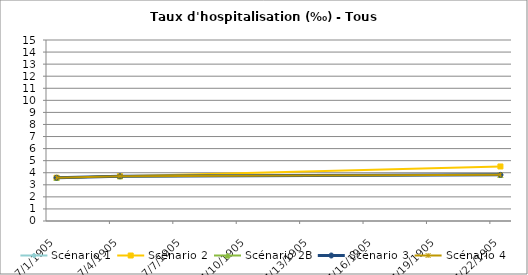
| Category | Scénario 1 | Scénario 2 | Scénario 2B | Scénario 3 | Scénario 4 |
|---|---|---|---|---|---|
| 2009.0 | 3.586 | 3.586 | 3.586 | 3.586 | 3.586 |
| 2012.0 | 3.709 | 3.709 | 3.709 | 3.709 | 3.709 |
| 2030.0 | 3.824 | 4.519 | 3.824 | 3.824 | 3.824 |